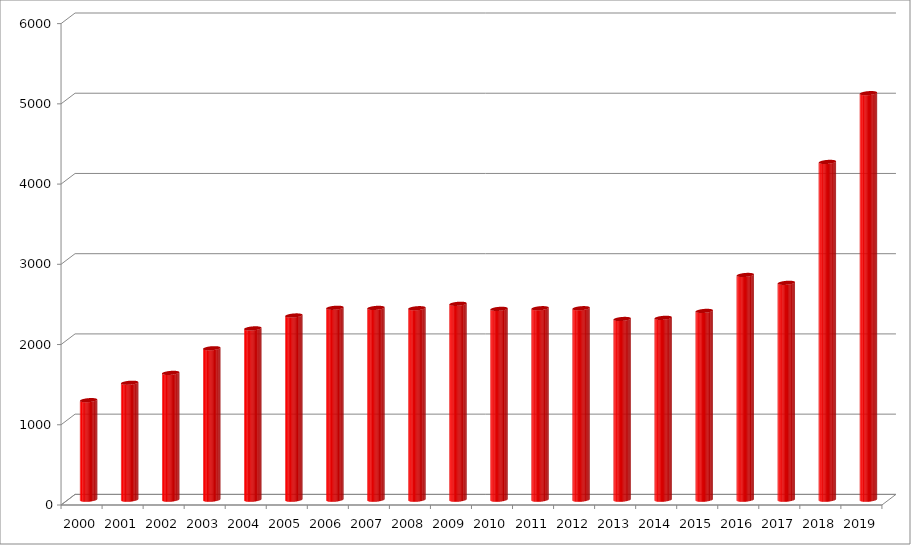
| Category | Series 0 |
|---|---|
| 2000.0 | 1240.5 |
| 2001.0 | 1457.5 |
| 2002.0 | 1580.5 |
| 2003.0 | 1887.5 |
| 2004.0 | 2135 |
| 2005.0 | 2296 |
| 2006.0 | 2392 |
| 2007.0 | 2390.5 |
| 2008.0 | 2386.5 |
| 2009.0 | 2441.5 |
| 2010.0 | 2378.5 |
| 2011.0 | 2386.5 |
| 2012.0 | 2386.5 |
| 2013.0 | 2252.5 |
| 2014.0 | 2266.5 |
| 2015.0 | 2353 |
| 2016.0 | 2801 |
| 2017.0 | 2703 |
| 2018.0 | 4210 |
| 2019.0 | 5067 |